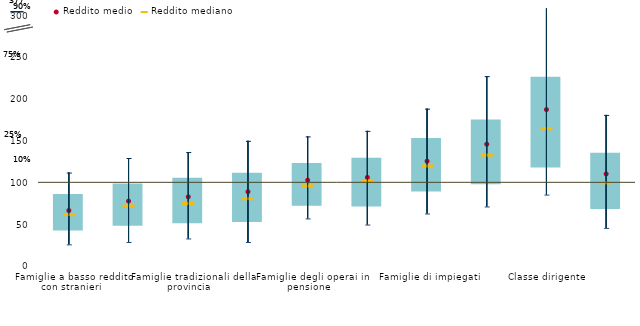
| Category | 1° quarto | 3° quarto- 1° quarto |
|---|---|---|
| Famiglie a basso reddito con stranieri | 43.522 | 42.497 |
| Famiglie a basso reddito di soli italiani | 49.279 | 49.261 |
| Famiglie tradizionali della provincia | 52.178 | 53.416 |
| Anziane sole e giovani disoccuapti | 53.791 | 57.593 |
| Famiglie degli operai in pensione | 73.317 | 49.725 |
| Giovani blue-collar | 72.368 | 57.153 |
| Famiglie di impiegati | 90.294 | 62.717 |
| Pensioni d'argento | 98.822 | 76.285 |
| Classe dirigente | 118.848 | 107.211 |
| Totale famiglie | 69.294 | 66.07 |